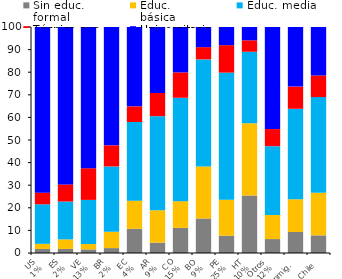
| Category | Sin educ.
formal | Educ.
básica | Educ. media | Técnica sup. | Universitaria |
|---|---|---|---|---|---|
| US
1% | 1.785 | 2.266 | 17.51 | 5.15 | 73.289 |
| ES
2% | 1.799 | 4.221 | 16.75 | 7.577 | 69.652 |
| VE
13% | 1.603 | 2.364 | 19.529 | 14.027 | 62.478 |
| BR
2% | 2.169 | 7.238 | 28.877 | 9.364 | 52.352 |
| EC
4% | 10.73 | 12.439 | 34.803 | 6.923 | 35.105 |
| AR
9% | 4.609 | 14.302 | 41.629 | 10.252 | 29.208 |
| CO
15% | 11.122 | 11.811 | 45.758 | 11.215 | 20.094 |
| BO
9% | 15.285 | 23.029 | 47.356 | 5.408 | 8.922 |
| PE
25% | 7.669 | 15.942 | 56.209 | 12.141 | 8.038 |
| HT
10% | 25.466 | 32 | 31.574 | 5.068 | 5.892 |
| Otros
12% | 6.167 | 10.657 | 30.442 | 7.577 | 45.157 |
| Inmig. | 9.285 | 14.487 | 40.041 | 9.833 | 26.355 |
| Chile | 7.804 | 18.839 | 42.34 | 9.573 | 21.444 |